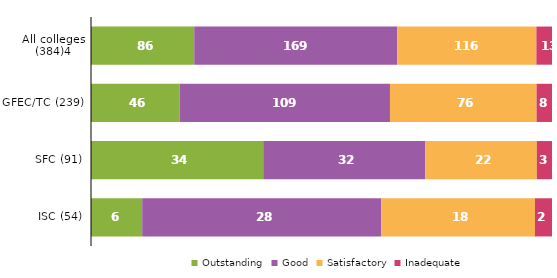
| Category | Outstanding | Good | Satisfactory | Inadequate |
|---|---|---|---|---|
| All colleges (384)4 | 86 | 169 | 116 | 13 |
| GFEC/TC (239) | 46 | 109 | 76 | 8 |
| SFC (91) | 34 | 32 | 22 | 3 |
| ISC (54) | 6 | 28 | 18 | 2 |